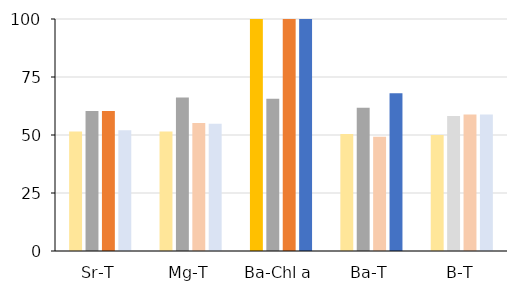
| Category | FO | IOM | ICE | GOM |
|---|---|---|---|---|
| Sr-T | 51.515 | 60.294 | 60.294 | 52 |
| Mg-T | 51.515 | 66.176 | 55.147 | 54.902 |
| Ba-Chl a | 100 | 65.625 | 100 | 100 |
| Ba-T | 50.382 | 61.765 | 49.265 | 68 |
| B-T | 50 | 58.209 | 58.824 | 58.824 |